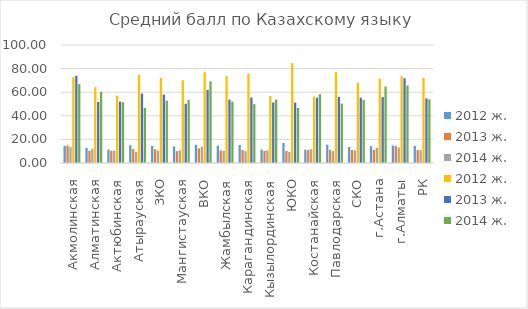
| Category | 2012 ж. | 2013 ж. | 2014 ж. |
|---|---|---|---|
| Акмолинская | 72.665 | 73.926 | 66.857 |
| Алматинская | 64.199 | 51.737 | 60.238 |
| Актюбинская | 57.088 | 52.045 | 51.485 |
| Атырауская | 74.762 | 58.831 | 46.681 |
| ЗКО | 72.09 | 57.975 | 52.874 |
| Мангистауская | 70.169 | 50.188 | 53.482 |
| ВКО | 76.95 | 61.964 | 69.228 |
| Жамбылская | 73.858 | 53.707 | 52.013 |
| Карагандинская | 75.937 | 55.501 | 49.927 |
| Кызылординская | 56.897 | 51.286 | 53.731 |
| ЮКО | 84.664 | 51.16 | 46.69 |
| Костанайская | 56.25 | 55.403 | 58.297 |
| Павлодарская | 77.232 | 56.022 | 50.336 |
| СКО | 68.122 | 55.419 | 53.536 |
| г.Астана | 71.577 | 55.853 | 64.859 |
| г.Алматы | 73.567 | 71.826 | 65.729 |
| РК | 72.235 | 54.718 | 53.938 |